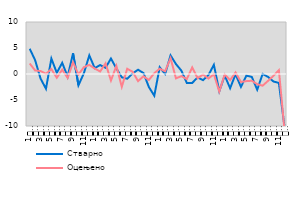
| Category | Стварно | Оцењено |
|---|---|---|
| 0 | 4.858 | 2.022 |
| 1900-01-01 | 2.661 | 0.677 |
| 1900-01-02 | -0.869 | 0.572 |
| 1900-01-03 | -2.837 | 0.047 |
| 1900-01-04 | 2.968 | 0.948 |
| 1900-01-05 | 0.223 | -0.717 |
| 1900-01-06 | 2.149 | 0.837 |
| 1900-01-07 | -0.505 | -0.757 |
| 1900-01-08 | 3.989 | 2.255 |
| 1900-01-09 | -2.169 | -0.102 |
| 1900-01-10 | 0.153 | 1.312 |
| 1900-01-11 | 3.57 | 1.752 |
| 1900-01-12 | 1.132 | 1.057 |
| 1900-01-13 | 1.717 | 0.488 |
| 1900-01-14 | 1.191 | 2.052 |
| 1900-01-15 | 2.98 | -1.253 |
| 1900-01-16 | 1.068 | 1.569 |
| 1900-01-17 | -0.636 | -2.469 |
| 1900-01-18 | -0.911 | 1.006 |
| 1900-01-19 | 0.103 | 0.429 |
| 1900-01-20 | 0.82 | -1.371 |
| 1900-01-21 | 0.191 | -0.443 |
| 1900-01-22 | -2.505 | -1.145 |
| 1900-01-23 | -4.177 | 0.156 |
| 1900-01-24 | 1.297 | 1.014 |
| 1900-01-25 | 0.005 | 0.526 |
| 1900-01-26 | 3.581 | 3.054 |
| 1900-01-27 | 1.91 | -0.842 |
| 1900-01-28 | 0.65 | -0.405 |
| 1900-01-29 | -1.712 | -0.982 |
| 1900-01-30 | -1.719 | 1.271 |
| 1900-01-31 | -0.648 | -0.814 |
| 1900-02-01 | -1.193 | -0.089 |
| 1900-02-02 | -0.199 | -0.865 |
| 1900-02-03 | 1.768 | -0.045 |
| 1900-02-04 | -3.324 | -3.381 |
| 1900-02-05 | -0.308 | -0.082 |
| 1900-02-06 | -2.74 | -1.176 |
| 1900-02-07 | -0.042 | 0.295 |
| 1900-02-08 | -2.475 | -1.531 |
| 1900-02-09 | -0.309 | -1.368 |
| 1900-02-10 | -0.563 | -1.298 |
| 1900-02-11 | -3.023 | -1.959 |
| 1900-02-12 | 0.009 | -2.247 |
| 1900-02-13 | -0.558 | -1.32 |
| 1900-02-14 | -1.439 | -0.355 |
| 1900-02-15 | -1.719 | 0.745 |
| 1900-02-16 | -9.852 | -10.365 |